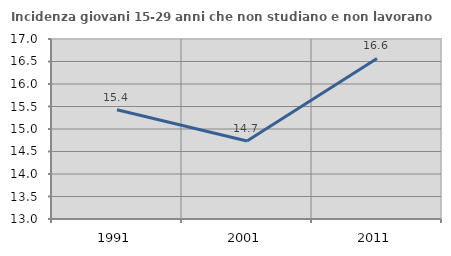
| Category | Incidenza giovani 15-29 anni che non studiano e non lavorano  |
|---|---|
| 1991.0 | 15.428 |
| 2001.0 | 14.733 |
| 2011.0 | 16.568 |